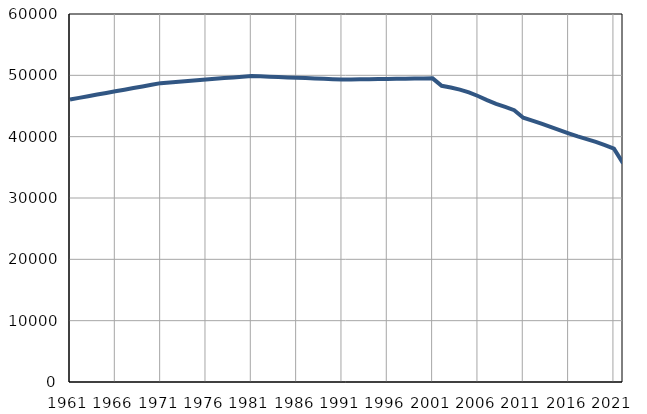
| Category | Број
становника |
|---|---|
| 1961.0 | 46062 |
| 1962.0 | 46329 |
| 1963.0 | 46595 |
| 1964.0 | 46862 |
| 1965.0 | 47128 |
| 1966.0 | 47395 |
| 1967.0 | 47661 |
| 1968.0 | 47928 |
| 1969.0 | 48194 |
| 1970.0 | 48460 |
| 1971.0 | 48727 |
| 1972.0 | 48845 |
| 1973.0 | 48961 |
| 1974.0 | 49079 |
| 1975.0 | 49195 |
| 1976.0 | 49313 |
| 1977.0 | 49430 |
| 1978.0 | 49547 |
| 1979.0 | 49664 |
| 1980.0 | 49781 |
| 1981.0 | 49898 |
| 1982.0 | 49839 |
| 1983.0 | 49781 |
| 1984.0 | 49722 |
| 1985.0 | 49663 |
| 1986.0 | 49605 |
| 1987.0 | 49546 |
| 1988.0 | 49487 |
| 1989.0 | 49428 |
| 1990.0 | 49370 |
| 1991.0 | 49311 |
| 1992.0 | 49332 |
| 1993.0 | 49351 |
| 1994.0 | 49371 |
| 1995.0 | 49391 |
| 1996.0 | 49411 |
| 1997.0 | 49431 |
| 1998.0 | 49451 |
| 1999.0 | 49471 |
| 2000.0 | 49491 |
| 2001.0 | 49511 |
| 2002.0 | 48296 |
| 2003.0 | 48007 |
| 2004.0 | 47662 |
| 2005.0 | 47216 |
| 2006.0 | 46631 |
| 2007.0 | 45960 |
| 2008.0 | 45351 |
| 2009.0 | 44852 |
| 2010.0 | 44324 |
| 2011.0 | 43097 |
| 2012.0 | 42621 |
| 2013.0 | 42110 |
| 2014.0 | 41587 |
| 2015.0 | 41078 |
| 2016.0 | 40550 |
| 2017.0 | 40055 |
| 2018.0 | 39609 |
| 2019.0 | 39141 |
| 2020.0 | 38630 |
| 2021.0 | 38051 |
| 2022.0 | 35674 |